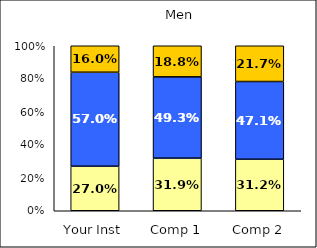
| Category | Low Civic Engagement | Average Civic Engagement | High Civic Engagement |
|---|---|---|---|
| Your Inst | 0.27 | 0.57 | 0.16 |
| Comp 1 | 0.319 | 0.493 | 0.188 |
| Comp 2 | 0.312 | 0.471 | 0.217 |